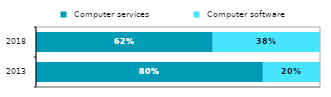
| Category |  Computer services |  Computer software |
|---|---|---|
|  2013 | 0.799 | 0.201 |
| 2018 | 0.622 | 0.378 |